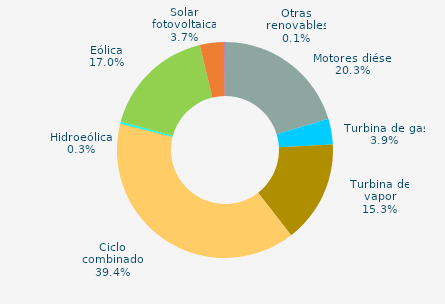
| Category | Series 0 |
|---|---|
| Motores diésel | 20.32 |
| Turbina de gas | 3.861 |
| Turbina de vapor | 15.322 |
| Ciclo combinado | 39.399 |
| Cogeneración | -0.002 |
| Hidráulica | 0.04 |
| Hidroeólica | 0.287 |
| Eólica | 17.022 |
| Solar fotovoltaica | 3.651 |
| Otras renovables | 0.099 |